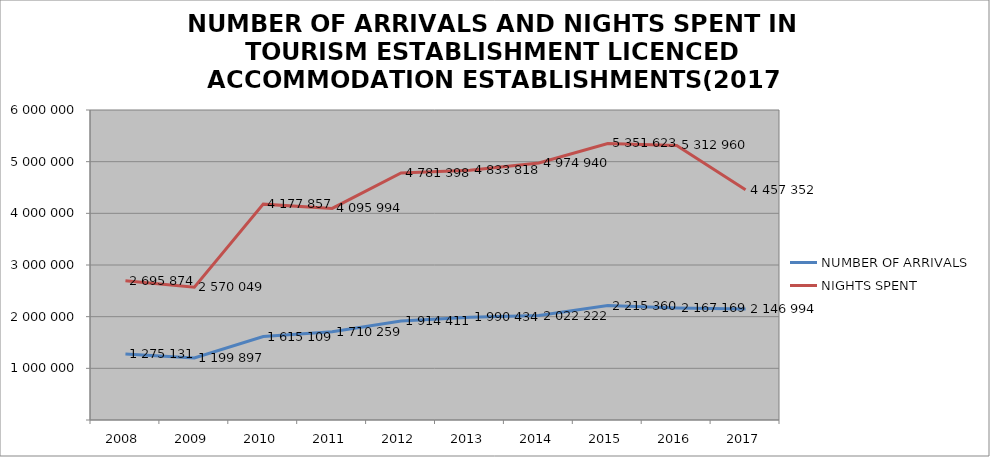
| Category | NUMBER OF ARRIVALS | NIGHTS SPENT |
|---|---|---|
| 2008 | 1275131 | 2695874 |
| 2009 | 1199897 | 2570049 |
| 2010 | 1615109 | 4177857 |
| 2011 | 1710259 | 4095994 |
| 2012 | 1914411 | 4781398 |
| 2013 | 1990434 | 4833818 |
| 2014 | 2022222 | 4974940 |
| 2015 | 2215360 | 5351623 |
| 2016 | 2167169 | 5312960 |
| 2017 | 2146994 | 4457352 |